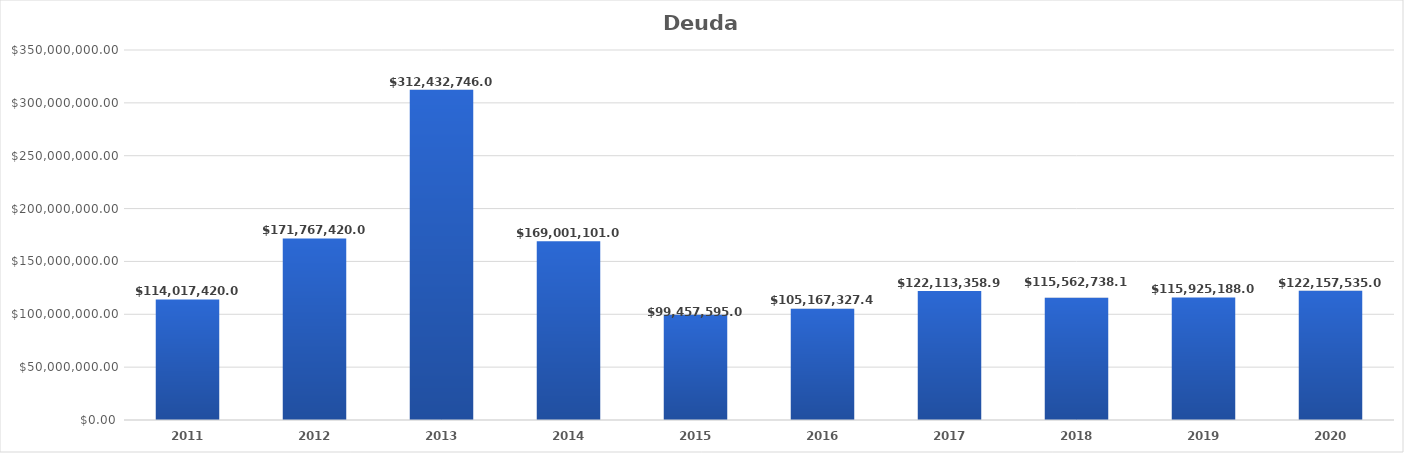
| Category | Deuda Pública |
|---|---|
| 2011.0 | 114017420 |
| 2012.0 | 171767420 |
| 2013.0 | 312432746 |
| 2014.0 | 169001101 |
| 2015.0 | 99457595 |
| 2016.0 | 105167327.47 |
| 2017.0 | 122113358.96 |
| 2018.0 | 115562738.17 |
| 2019.0 | 115925188 |
| 2020.0 | 122157535 |